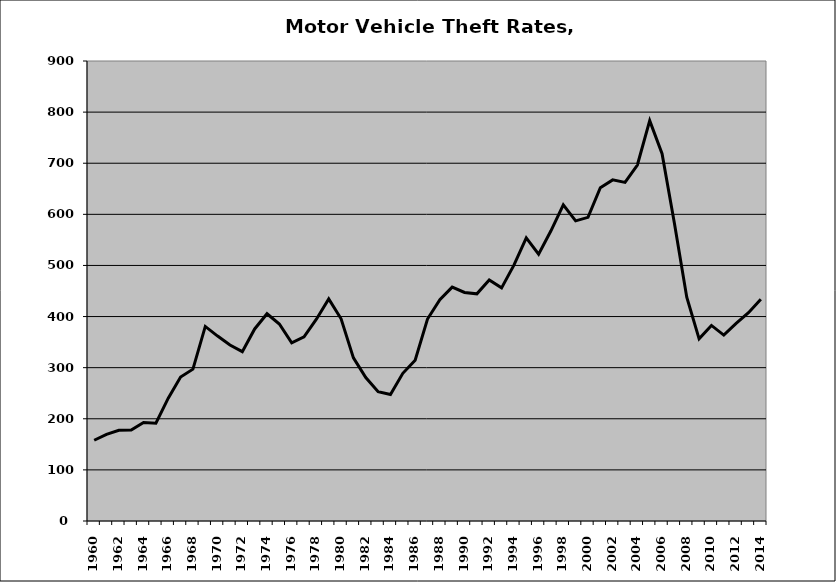
| Category | Motor Vehicle |
|---|---|
| 1960.0 | 157.962 |
| 1961.0 | 169.573 |
| 1962.0 | 177.345 |
| 1963.0 | 177.934 |
| 1964.0 | 192.728 |
| 1965.0 | 191.472 |
| 1966.0 | 240.369 |
| 1967.0 | 281.535 |
| 1968.0 | 297.1 |
| 1969.0 | 380.688 |
| 1970.0 | 361.818 |
| 1971.0 | 344.274 |
| 1972.0 | 331.281 |
| 1973.0 | 375.736 |
| 1974.0 | 405.524 |
| 1975.0 | 385.384 |
| 1976.0 | 348.726 |
| 1977.0 | 360.334 |
| 1978.0 | 394.886 |
| 1979.0 | 434.463 |
| 1980.0 | 395.592 |
| 1981.0 | 319.207 |
| 1982.0 | 280.777 |
| 1983.0 | 252.977 |
| 1984.0 | 247.436 |
| 1985.0 | 288.932 |
| 1986.0 | 314.519 |
| 1987.0 | 395.152 |
| 1988.0 | 432.908 |
| 1989.0 | 457.614 |
| 1990.0 | 447.1 |
| 1991.0 | 444.5 |
| 1992.0 | 471.456 |
| 1993.0 | 456.118 |
| 1994.0 | 500.524 |
| 1995.0 | 553.986 |
| 1996.0 | 522.194 |
| 1997.0 | 567.825 |
| 1998.0 | 618.738 |
| 1999.0 | 587.298 |
| 2000.0 | 594.117 |
| 2001.0 | 652.002 |
| 2002.0 | 667.424 |
| 2003.0 | 662.47 |
| 2004.0 | 696.515 |
| 2005.0 | 783.341 |
| 2006.0 | 718.628 |
| 2007.0 | 582.677 |
| 2008.0 | 437.781 |
| 2009.0 | 356.337 |
| 2010.0 | 382.614 |
| 2011.0 | 363.755 |
| 2012.0 | 386.683 |
| 2013.0 | 407.6 |
| 2014.0 | 433.999 |